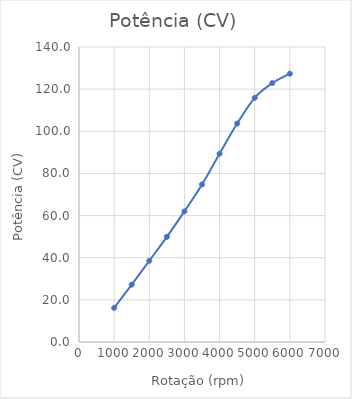
| Category | Potência |
|---|---|
| 1000.0 | 16.197 |
| 1500.0 | 27.227 |
| 2000.0 | 38.537 |
| 2500.0 | 49.916 |
| 3000.0 | 61.994 |
| 3500.0 | 74.77 |
| 4000.0 | 89.361 |
| 4500.0 | 103.673 |
| 5000.0 | 115.89 |
| 5500.0 | 122.871 |
| 6000.0 | 127.339 |